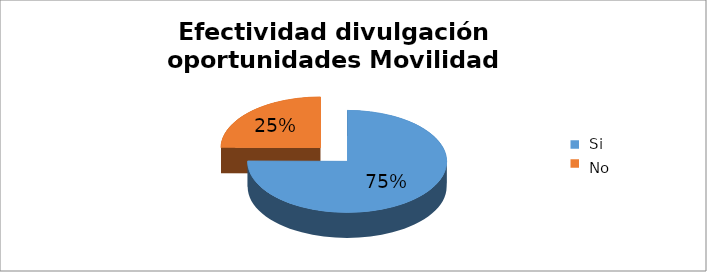
| Category | Series 0 |
|---|---|
| 0 | 0.751 |
| 1 | 0.249 |